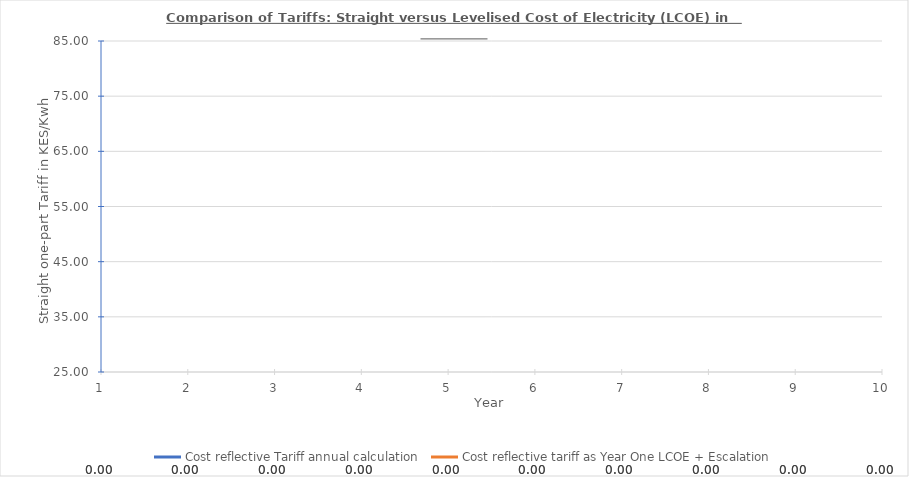
| Category | Cost reflective Tariff annual calculation | Cost reflective tariff as Year One LCOE + Escalation |
|---|---|---|
| 1.0 | 0 | 0 |
| 2.0 | 0 | 0 |
| 3.0 | 0 | 0 |
| 4.0 | 0 | 0 |
| 5.0 | 0 | 0 |
| 6.0 | 0 | 0 |
| 7.0 | 0 | 0 |
| 8.0 | 0 | 0 |
| 9.0 | 0 | 0 |
| 10.0 | 0 | 0 |